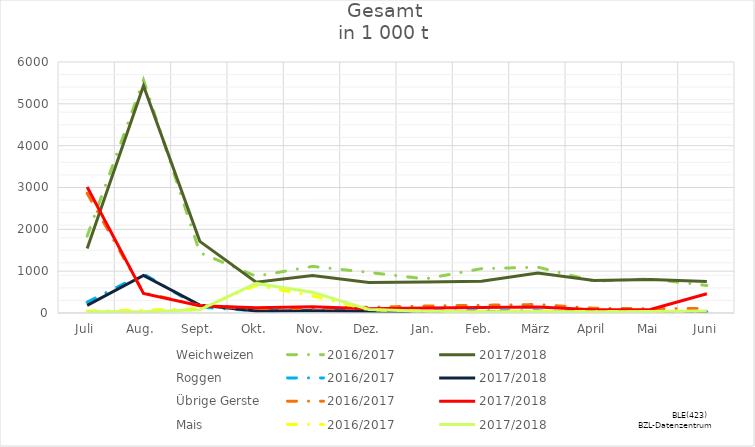
| Category | Weichweizen | 2016/2017 | 2017/2018 | Roggen | Übrige Gerste | Mais |
|---|---|---|---|---|---|---|
| Juli |  | 48.918 | 36.464 |  |  |  |
| Aug. |  | 66.521 | 28.78 |  |  |  |
| Sept. |  | 105.141 | 74.758 |  |  |  |
| Okt. |  | 660.42 | 706.977 |  |  |  |
| Nov. |  | 410.768 | 496.698 |  |  |  |
| Dez. |  | 75.727 | 86.26 |  |  |  |
| Jan. |  | 43.262 | 42.935 |  |  |  |
| Feb. |  | 35.109 | 31.648 |  |  |  |
| März |  | 43.059 | 35.71 |  |  |  |
| April |  | 34.154 | 27.711 |  |  |  |
| Mai |  | 37.015 | 37.964 |  |  |  |
| Juni |  | 42.641 | 47.069 |  |  |  |